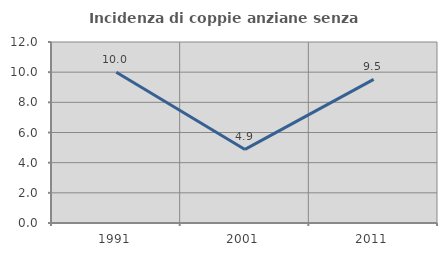
| Category | Incidenza di coppie anziane senza figli  |
|---|---|
| 1991.0 | 10 |
| 2001.0 | 4.878 |
| 2011.0 | 9.524 |